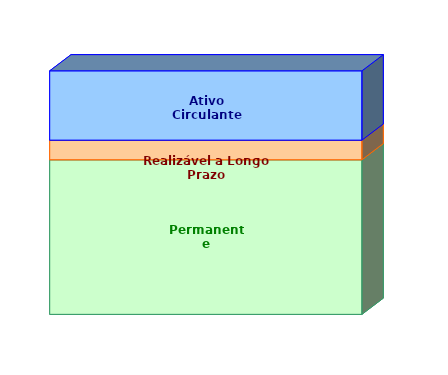
| Category | Permanente | Realizável a Longo Prazo | Ativo Circulante |
|---|---|---|---|
| 0 | 0.635 | 0.081 | 0.285 |